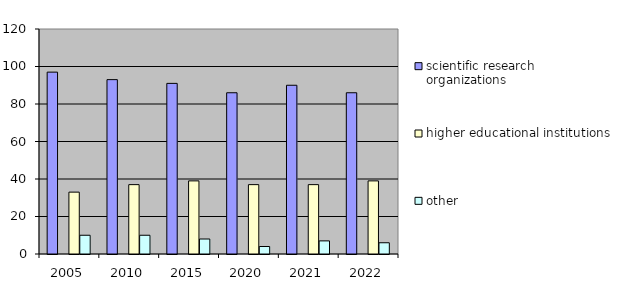
| Category | scientific research organizations    | Series 1 | higher educational institutions      | other  |
|---|---|---|---|---|
| 2005.0 | 97 |  | 33 | 10 |
| 2010.0 | 93 |  | 37 | 10 |
| 2015.0 | 91 |  | 39 | 8 |
| 2020.0 | 86 |  | 37 | 4 |
| 2021.0 | 90 |  | 37 | 7 |
| 2022.0 | 86 |  | 39 | 6 |